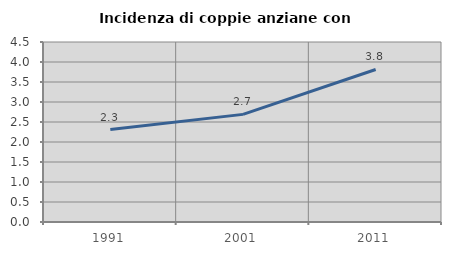
| Category | Incidenza di coppie anziane con figli |
|---|---|
| 1991.0 | 2.312 |
| 2001.0 | 2.691 |
| 2011.0 | 3.814 |